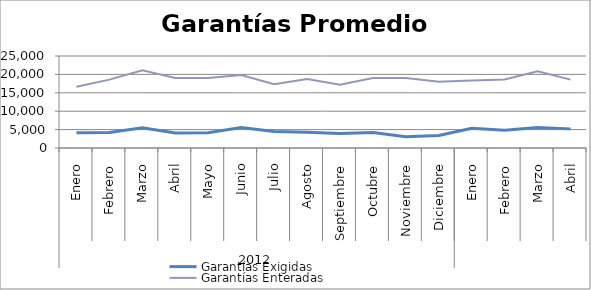
| Category | Garantías Exigidas | Garantías Enteradas |
|---|---|---|
| 0 | 4146.8 | 16662.483 |
| 1 | 4190.531 | 18572.749 |
| 2 | 5482.211 | 21128.648 |
| 3 | 4079.038 | 18997.51 |
| 4 | 4141.554 | 19005.364 |
| 5 | 5549.139 | 19818.91 |
| 6 | 4487.023 | 17351.39 |
| 7 | 4277.924 | 18719.955 |
| 8 | 3940.893 | 17217.403 |
| 9 | 4180.69 | 19046.939 |
| 10 | 3056.997 | 19028.425 |
| 11 | 3426.799 | 17994.819 |
| 12 | 5390.461 | 18317.043 |
| 13 | 4807.91 | 18608.477 |
| 14 | 5582.739 | 20850.446 |
| 15 | 5196.755 | 18583.166 |